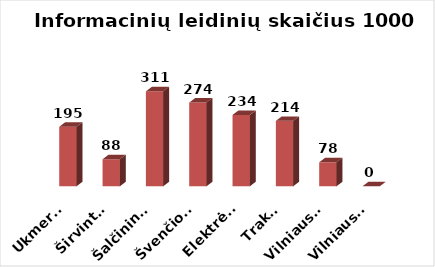
| Category | Series 0 |
|---|---|
| Ukmergė | 194.97 |
| Širvintos | 88.442 |
| Šalčininkai | 311.065 |
| Švenčionys | 274.194 |
| Elektrėnai | 233.656 |
| Trakai | 214.284 |
| Vilniaus r. | 78.475 |
| Vilniaus m. | 0 |